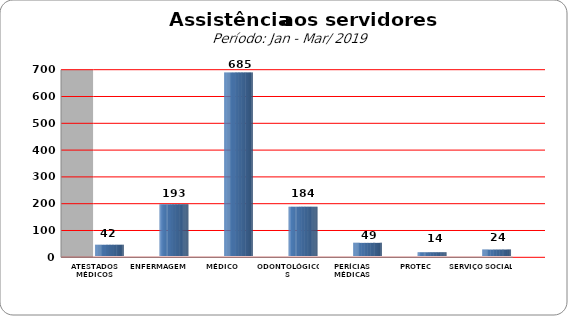
| Category | Series 0 |
|---|---|
| ATESTADOS MÉDICOS | 42 |
| ENFERMAGEM | 193 |
| MÉDICO | 685 |
| ODONTOLÓGICOS | 184 |
| PERÍCIAS MÉDICAS | 49 |
| PROTEC | 14 |
| SERVIÇO SOCIAL | 24 |